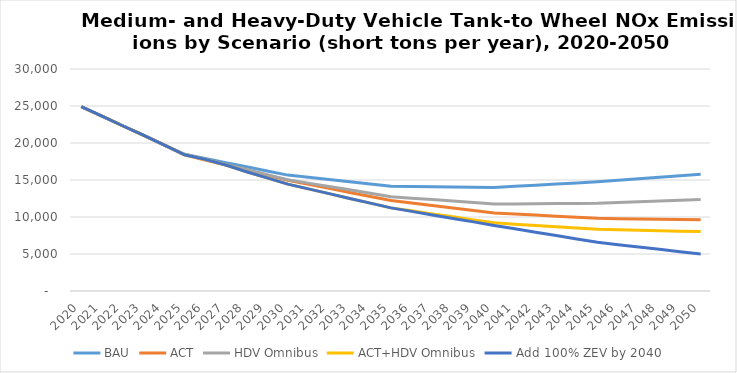
| Category | BAU | ACT | HDV Omnibus | ACT+HDV Omnibus | Add 100% ZEV by 2040 |
|---|---|---|---|---|---|
| 2020.0 | 24900 | 24900 | 24900 | 24900 | 24903.934 |
| 2021.0 | 23620 | 23620 | 23620 | 23620 | 23620 |
| 2022.0 | 22330 | 22330 | 22330 | 22330 | 22330 |
| 2023.0 | 21050 | 21050 | 21050 | 21050 | 21050 |
| 2024.0 | 19760 | 19760 | 19760 | 19760 | 19760 |
| 2025.0 | 18480 | 18400 | 18480 | 18400 | 18403.773 |
| 2026.0 | 17920 | 17710 | 17790 | 17790 | 17790 |
| 2027.0 | 17350 | 17030 | 17100 | 17030 | 17030 |
| 2028.0 | 16790 | 16340 | 16420 | 16120 | 16120 |
| 2029.0 | 16220 | 15660 | 15730 | 15280 | 15280 |
| 2030.0 | 15660 | 14970 | 15040 | 14440 | 14440.032 |
| 2031.0 | 15360 | 14420 | 14580 | 13800 | 13800 |
| 2032.0 | 15060 | 13870 | 14120 | 13160 | 13160 |
| 2033.0 | 14750 | 13320 | 13670 | 12510 | 12510 |
| 2034.0 | 14450 | 12770 | 13210 | 11870 | 11870 |
| 2035.0 | 14150 | 12220 | 12750 | 11230 | 11229.755 |
| 2036.0 | 14120 | 11890 | 12550 | 10830 | 10760 |
| 2037.0 | 14090 | 11550 | 12350 | 10420 | 10280 |
| 2038.0 | 14050 | 11220 | 12150 | 10020 | 9810 |
| 2039.0 | 14020 | 10880 | 11950 | 9610 | 9340 |
| 2040.0 | 13990 | 10550 | 11750 | 9210 | 8864.168 |
| 2041.0 | 14140 | 10400 | 11770 | 9030 | 8410 |
| 2042.0 | 14290 | 10260 | 11790 | 8860 | 7950 |
| 2043.0 | 14450 | 10110 | 11820 | 8680 | 7490 |
| 2044.0 | 14600 | 9970 | 11840 | 8510 | 7030 |
| 2045.0 | 14750 | 9820 | 11860 | 8330 | 6576.418 |
| 2046.0 | 14960 | 9780 | 11960 | 8270 | 6260 |
| 2047.0 | 15170 | 9740 | 12070 | 8210 | 5950 |
| 2048.0 | 15370 | 9710 | 12170 | 8150 | 5630 |
| 2049.0 | 15580 | 9670 | 12280 | 8090 | 5310 |
| 2050.0 | 15790 | 9630 | 12380 | 8030 | 4999.124 |